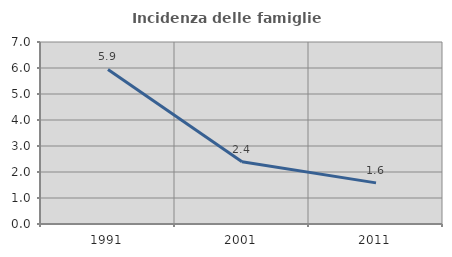
| Category | Incidenza delle famiglie numerose |
|---|---|
| 1991.0 | 5.944 |
| 2001.0 | 2.397 |
| 2011.0 | 1.582 |